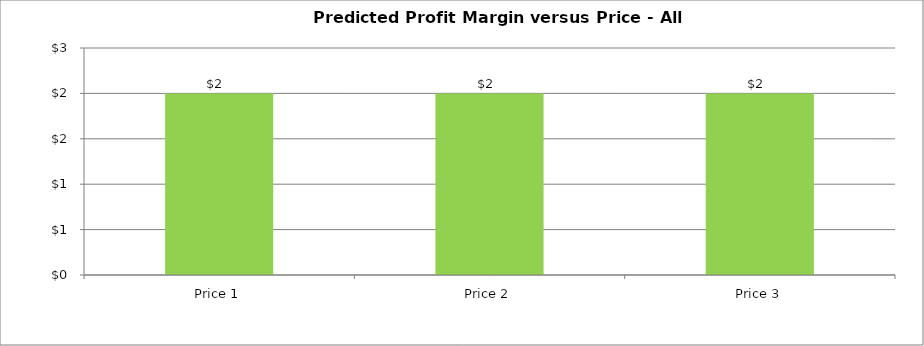
| Category | Predicted Margin |
|---|---|
| Price 1 | 2 |
| Price 2 | 2 |
| Price 3 | 2 |